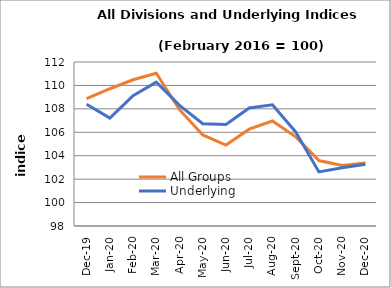
| Category | All Groups | Underlying |
|---|---|---|
| 2019-12-01 | 108.864 | 108.4 |
| 2020-01-01 | 109.718 | 107.211 |
| 2020-02-01 | 110.483 | 109.121 |
| 2020-03-01 | 111.043 | 110.276 |
| 2020-04-01 | 107.93 | 108.297 |
| 2020-05-01 | 105.77 | 106.735 |
| 2020-06-01 | 104.913 | 106.661 |
| 2020-07-01 | 106.265 | 108.077 |
| 2020-08-01 | 106.963 | 108.349 |
| 2020-09-01 | 105.614 | 106.027 |
| 2020-10-01 | 103.588 | 102.619 |
| 2020-11-01 | 103.171 | 102.969 |
| 2020-12-01 | 103.378 | 103.266 |